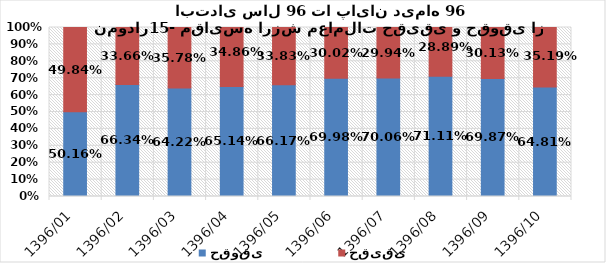
| Category | حقوقی | حقیقی |
|---|---|---|
| 1396/01 | 0.502 | 0.498 |
| 1396/02 | 0.663 | 0.337 |
| 1396/03 | 0.642 | 0.358 |
| 1396/04 | 0.651 | 0.349 |
| 1396/05 | 0.662 | 0.338 |
| 1396/06 | 0.7 | 0.3 |
| 1396/07 | 0.701 | 0.299 |
| 1396/08 | 0.711 | 0.289 |
| 1396/09 | 0.699 | 0.301 |
| 1396/10 | 0.648 | 0.352 |